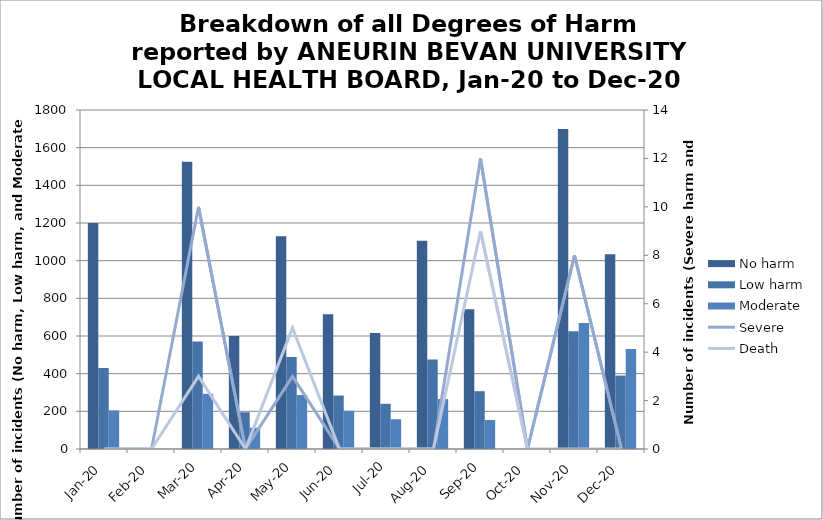
| Category | No harm | Low harm | Moderate |
|---|---|---|---|
| Jan-20 | 1200 | 430 | 205 |
| Feb-20 | 0 | 0 | 0 |
| Mar-20 | 1525 | 571 | 293 |
| Apr-20 | 600 | 195 | 113 |
| May-20 | 1129 | 489 | 287 |
| Jun-20 | 715 | 284 | 203 |
| Jul-20 | 616 | 240 | 158 |
| Aug-20 | 1106 | 475 | 265 |
| Sep-20 | 742 | 307 | 154 |
| Oct-20 | 0 | 0 | 0 |
| Nov-20 | 1699 | 625 | 669 |
| Dec-20 | 1034 | 390 | 531 |